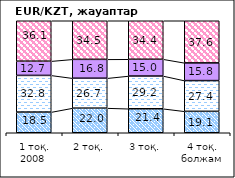
| Category | повысится | не изменится | снизится | не знаю |
|---|---|---|---|---|
| 1 тоқ. 2008  | 18.46 | 32.75 | 12.72 | 36.07 |
| 2 тоқ. | 21.98 | 26.74 | 16.84 | 34.45 |
| 3 тоқ. | 21.42 | 29.24 | 14.96 | 34.39 |
| 4 тоқ. болжам | 19.13 | 27.44 | 15.82 | 37.61 |